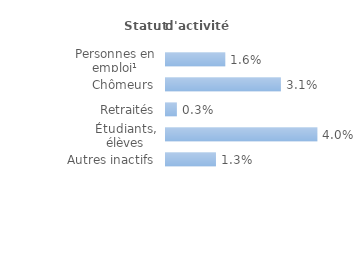
| Category | Series 0 |
|---|---|
| Personnes en emploi¹ | 0.016 |
| Chômeurs | 0.031 |
| Retraités | 0.003 |
| Étudiants, élèves | 0.04 |
| Autres inactifs  | 0.013 |